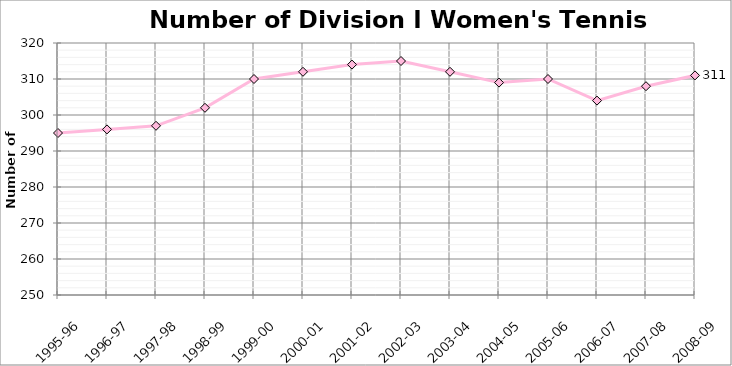
| Category | Women |
|---|---|
| 1995-96 | 295 |
| 1996-97 | 296 |
| 1997-98 | 297 |
| 1998-99 | 302 |
| 1999-00 | 310 |
| 2000-01 | 312 |
| 2001-02 | 314 |
| 2002-03 | 315 |
| 2003-04 | 312 |
| 2004-05 | 309 |
| 2005-06 | 310 |
| 2006-07 | 304 |
| 2007-08 | 308 |
| 2008-09 | 311 |